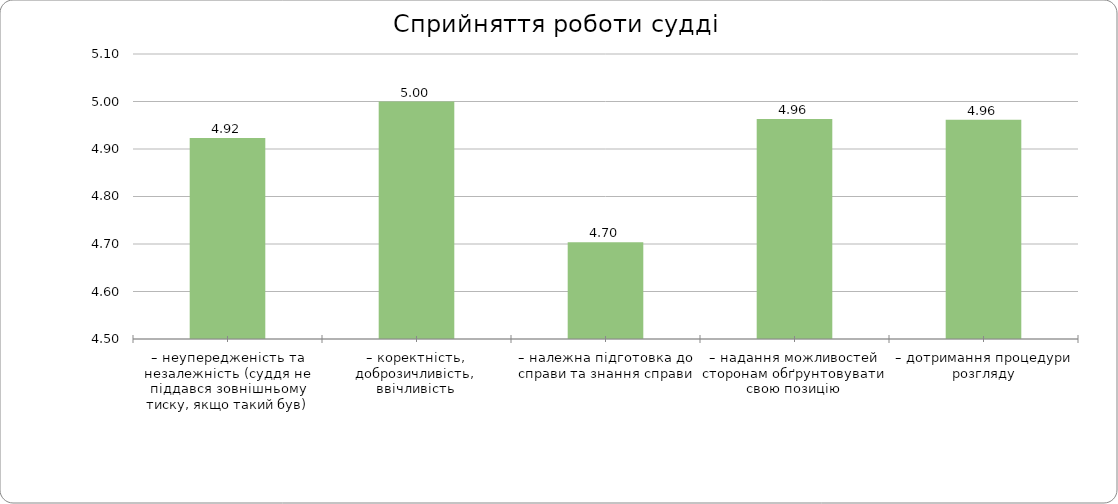
| Category | Series 0 |
|---|---|
| – неупередженість та незалежність (суддя не піддався зовнішньому тиску, якщо такий був) | 4.923 |
| – коректність, доброзичливість, ввічливість | 5 |
| – належна підготовка до справи та знання справи | 4.704 |
| – надання можливостей сторонам обґрунтовувати свою позицію | 4.963 |
| – дотримання процедури розгляду | 4.962 |